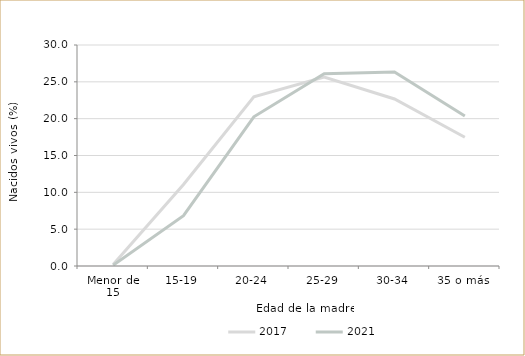
| Category | 2017 | 2021 |
|---|---|---|
| Menor de 15 | 0.194 | 0.11 |
| 15-19 | 11.057 | 6.826 |
| 20-24 | 22.962 | 20.257 |
| 25-29 | 25.636 | 26.091 |
| 30-34 | 22.676 | 26.348 |
| 35 o más | 17.475 | 20.368 |